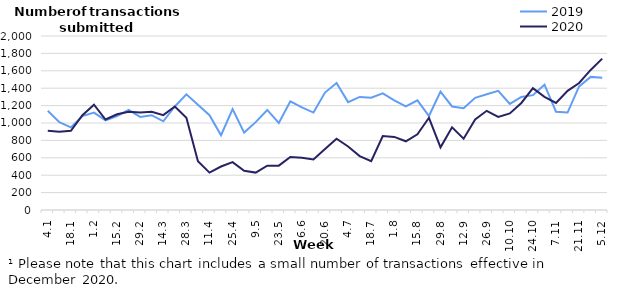
| Category | 2019 | 2020 |
|---|---|---|
| 43834.0 | 1140 | 910 |
| 43841.0 | 1010 | 900 |
| 43848.0 | 950 | 910 |
| 43855.0 | 1080 | 1090 |
| 43862.0 | 1120 | 1210 |
| 43869.0 | 1030 | 1040 |
| 43876.0 | 1080 | 1100 |
| 43883.0 | 1150 | 1130 |
| 43890.0 | 1070 | 1120 |
| 43897.0 | 1090 | 1130 |
| 43904.0 | 1020 | 1090 |
| 43911.0 | 1190 | 1190 |
| 43918.0 | 1330 | 1060 |
| 43925.0 | 1210 | 560 |
| 43932.0 | 1090 | 430 |
| 43939.0 | 860 | 500 |
| 43946.0 | 1160 | 550 |
| 43953.0 | 890 | 450 |
| 43960.0 | 1010 | 430 |
| 43967.0 | 1150 | 510 |
| 43974.0 | 1000 | 510 |
| 43981.0 | 1250 | 610 |
| 43988.0 | 1180 | 600 |
| 43995.0 | 1120 | 580 |
| 44002.0 | 1350 | 700 |
| 44009.0 | 1460 | 820 |
| 44016.0 | 1240 | 730 |
| 44023.0 | 1300 | 620 |
| 44030.0 | 1290 | 560 |
| 44037.0 | 1340 | 850 |
| 44044.0 | 1260 | 840 |
| 44051.0 | 1190 | 790 |
| 44058.0 | 1260 | 870 |
| 44065.0 | 1080 | 1060 |
| 44072.0 | 1360 | 720 |
| 44079.0 | 1190 | 950 |
| 44086.0 | 1170 | 820 |
| 44093.0 | 1290 | 1040 |
| 44100.0 | 1330 | 1140 |
| 44107.0 | 1370 | 1070 |
| 44114.0 | 1220 | 1110 |
| 44121.0 | 1300 | 1230 |
| 44128.0 | 1320 | 1400 |
| 44135.0 | 1440 | 1300 |
| 44142.0 | 1130 | 1230 |
| 44149.0 | 1120 | 1370 |
| 44156.0 | 1420 | 1460 |
| 44163.0 | 1530 | 1610 |
| 44170.0 | 1520 | 1740 |